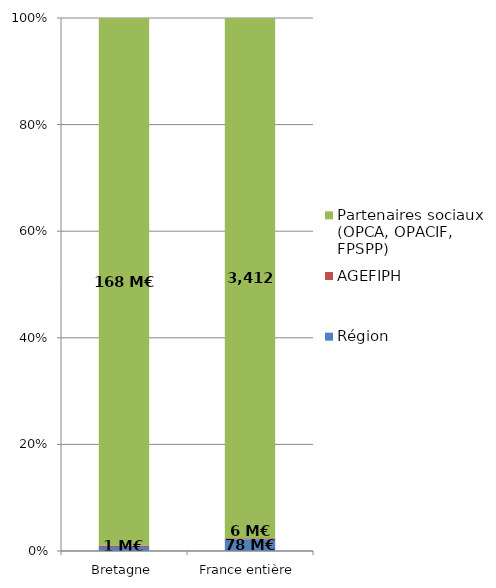
| Category | Région | AGEFIPH | Partenaires sociaux (OPCA, OPACIF, FPSPP) |
|---|---|---|---|
| Bretagne | 1.291 | 0.495 | 167.578 |
| France entière | 77.612 | 6.161 | 3411.683 |